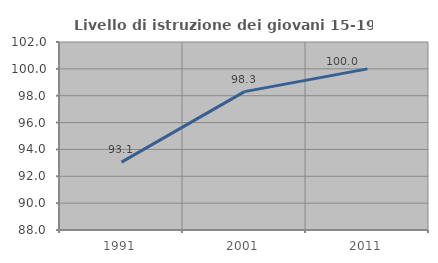
| Category | Livello di istruzione dei giovani 15-19 anni |
|---|---|
| 1991.0 | 93.056 |
| 2001.0 | 98.305 |
| 2011.0 | 100 |